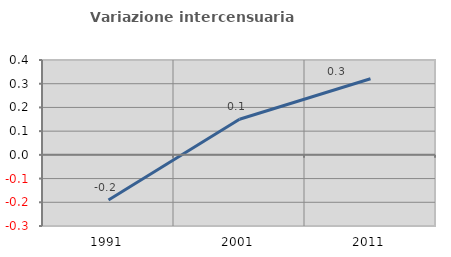
| Category | Variazione intercensuaria annua |
|---|---|
| 1991.0 | -0.191 |
| 2001.0 | 0.15 |
| 2011.0 | 0.321 |